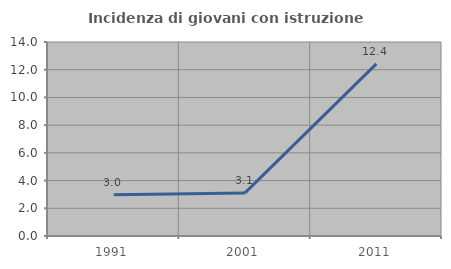
| Category | Incidenza di giovani con istruzione universitaria |
|---|---|
| 1991.0 | 2.976 |
| 2001.0 | 3.111 |
| 2011.0 | 12.422 |